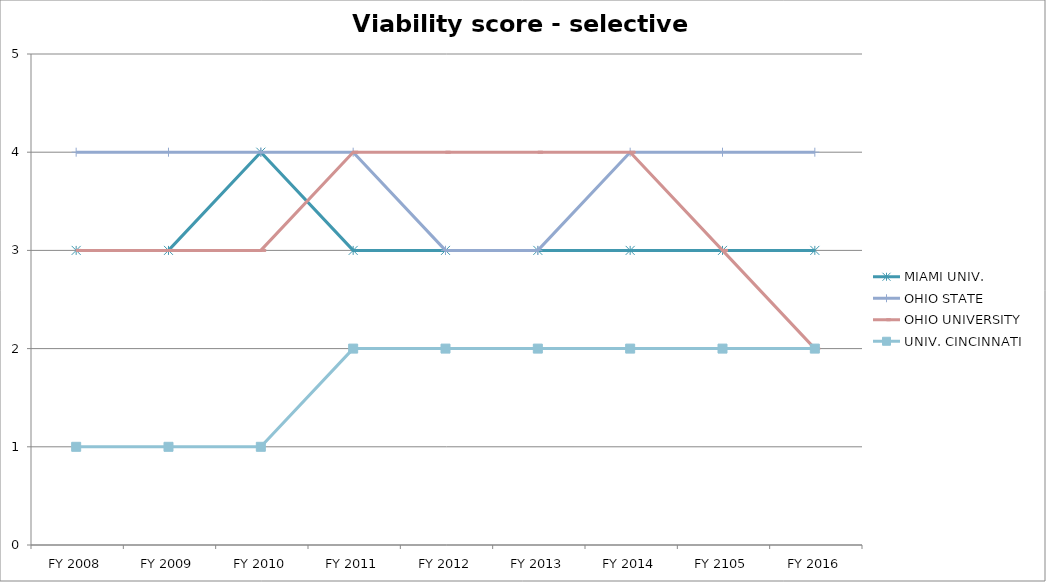
| Category | MIAMI UNIV.  | OHIO STATE  | OHIO UNIVERSITY  | UNIV. CINCINNATI  |
|---|---|---|---|---|
| FY 2016 | 3 | 4 | 2 | 2 |
| FY 2105 | 3 | 4 | 3 | 2 |
| FY 2014 | 3 | 4 | 4 | 2 |
| FY 2013 | 3 | 3 | 4 | 2 |
| FY 2012 | 3 | 3 | 4 | 2 |
| FY 2011 | 3 | 4 | 4 | 2 |
| FY 2010 | 4 | 4 | 3 | 1 |
| FY 2009 | 3 | 4 | 3 | 1 |
| FY 2008 | 3 | 4 | 3 | 1 |